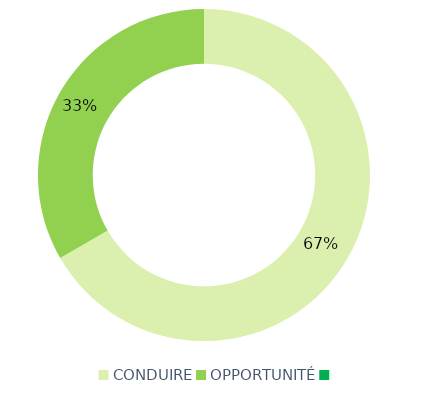
| Category | Series 0 |
|---|---|
| CONDUIRE | 44 |
| OPPORTUNITÉ | 22 |